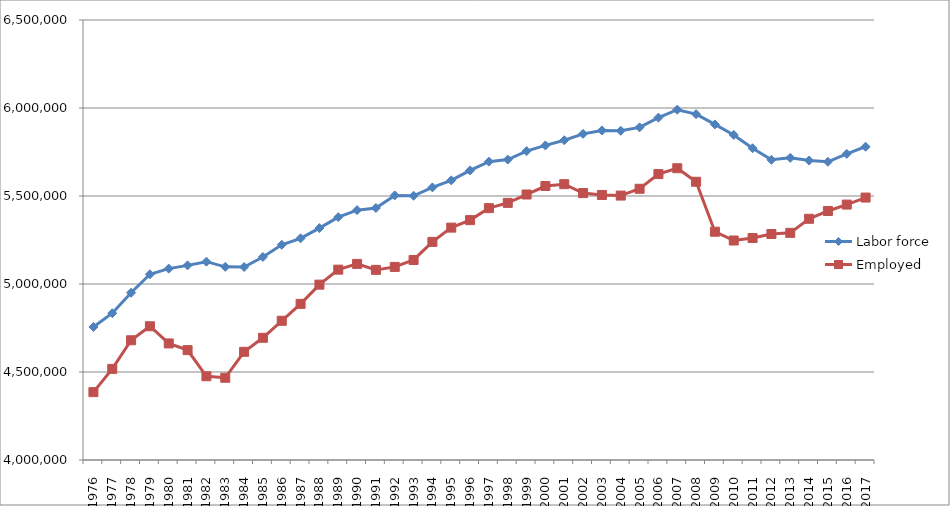
| Category | Labor force | Employed |
|---|---|---|
| 1976 | 4755748 | 4385605 |
| 1977 | 4833856 | 4517698 |
| 1978 | 4950642 | 4680243 |
| 1979 | 5055136 | 4759906 |
| 1980 | 5087387 | 4662318 |
| 1981 | 5105836 | 4624361 |
| 1982 | 5126857 | 4475830 |
| 1983 | 5097422 | 4467277 |
| 1984 | 5096523 | 4614643 |
| 1985 | 5153700 | 4694344 |
| 1986 | 5222904 | 4791014 |
| 1987 | 5259505 | 4887075 |
| 1988 | 5317556 | 4996315 |
| 1989 | 5380101 | 5081552 |
| 1990 | 5419623 | 5114242 |
| 1991 | 5431912 | 5080289 |
| 1992 | 5503260 | 5097104 |
| 1993 | 5501305 | 5136613 |
| 1994 | 5548818 | 5239265 |
| 1995 | 5589102 | 5320351 |
| 1996 | 5645423 | 5362986 |
| 1997 | 5695177 | 5431051 |
| 1998 | 5707110 | 5460917 |
| 1999 | 5754992 | 5508439 |
| 2000 | 5787343 | 5556757 |
| 2001 | 5816832 | 5567130 |
| 2002 | 5852985 | 5516645 |
| 2003 | 5872372 | 5505858 |
| 2004 | 5870479 | 5502444 |
| 2005 | 5890046 | 5541082 |
| 2006 | 5945482 | 5624435 |
| 2007 | 5990292 | 5657718 |
| 2008 | 5965166 | 5580843 |
| 2009 | 5906768 | 5297098 |
| 2010 | 5846886 | 5247050 |
| 2011 | 5771469 | 5261238 |
| 2012 | 5705591 | 5284001 |
| 2013 | 5716730 | 5290609 |
| 2014 | 5701477 | 5370560 |
| 2015 | 5694303 | 5414872 |
| 2016 | 5739296 | 5451315 |
| 2017 | 5780021 | 5491174 |